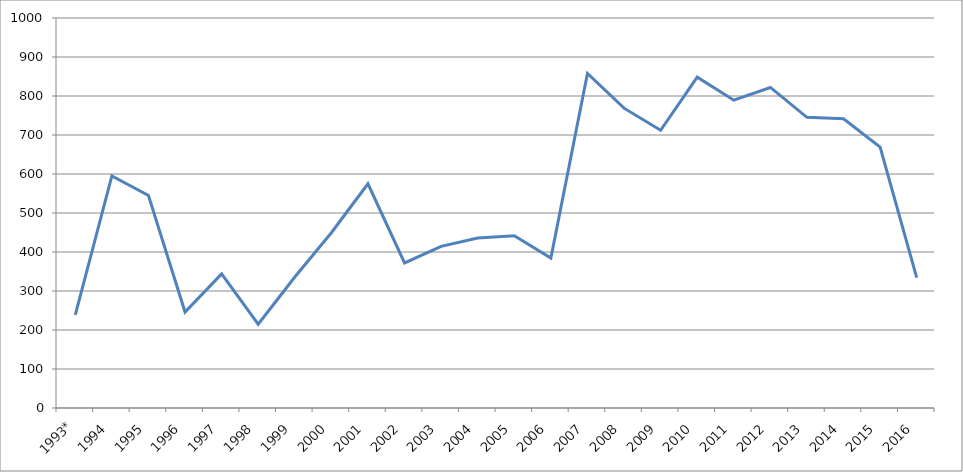
| Category | Series 0 |
|---|---|
| 1993* | 239 |
| 1994 | 595 |
| 1995 | 545 |
| 1996 | 246 |
| 1997 | 344 |
| 1998 | 215 |
| 1999 | 336 |
| 2000 | 449.4 |
| 2001 | 575 |
| 2002 | 372 |
| 2003 | 414.6 |
| 2004 | 435.8 |
| 2005 | 441.45 |
| 2006 | 384.6 |
| 2007 | 858.05 |
| 2008 | 768.8 |
| 2009 | 712.2 |
| 2010 | 848.4 |
| 2011 | 789.2 |
| 2012 | 821.9 |
| 2013 | 745.2 |
| 2014 | 741.5 |
| 2015 | 668.9 |
| 2016 | 334.5 |